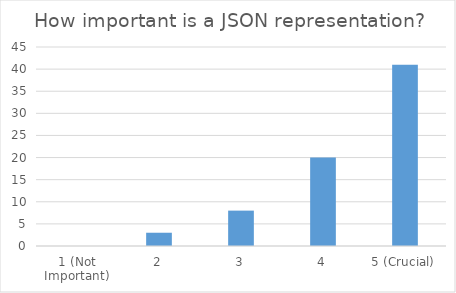
| Category | How important is a JSON representation? |
|---|---|
| 1 (Not Important) | 0 |
| 2 | 3 |
| 3 | 8 |
| 4 | 20 |
| 5 (Crucial) | 41 |